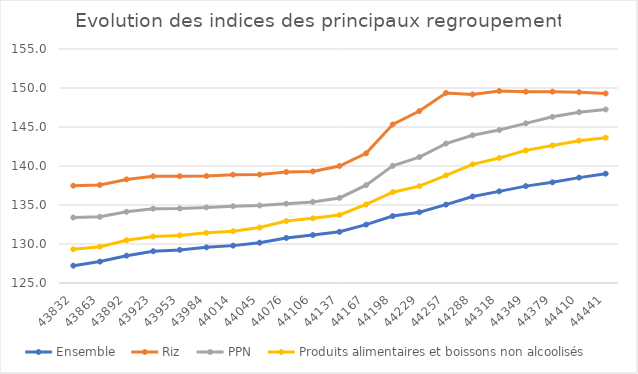
| Category |  Ensemble  |  Riz  |  PPN  |  Produits alimentaires et boissons non alcoolisés  |
|---|---|---|---|---|
| 2020-01-02 | 127.22 | 137.477 | 133.394 | 129.324 |
| 2020-02-02 | 127.747 | 137.571 | 133.482 | 129.658 |
| 2020-03-02 | 128.503 | 138.279 | 134.127 | 130.477 |
| 2020-04-02 | 129.073 | 138.691 | 134.528 | 130.962 |
| 2020-05-02 | 129.246 | 138.695 | 134.553 | 131.1 |
| 2020-06-02 | 129.569 | 138.715 | 134.691 | 131.433 |
| 2020-07-02 | 129.792 | 138.884 | 134.842 | 131.639 |
| 2020-08-02 | 130.165 | 138.908 | 134.939 | 132.108 |
| 2020-09-02 | 130.779 | 139.227 | 135.17 | 132.94 |
| 2020-10-02 | 131.152 | 139.307 | 135.396 | 133.293 |
| 2020-11-02 | 131.562 | 139.996 | 135.904 | 133.717 |
| 2020-12-02 | 132.488 | 141.627 | 137.548 | 135.07 |
| 2021-01-02 | 133.582 | 145.33 | 140.014 | 136.64 |
| 2021-02-02 | 134.068 | 147.047 | 141.147 | 137.422 |
| 2021-03-02 | 135.051 | 149.367 | 142.872 | 138.8 |
| 2021-04-02 | 136.088 | 149.178 | 143.938 | 140.217 |
| 2021-05-02 | 136.75 | 149.619 | 144.606 | 141.028 |
| 2021-06-02 | 137.421 | 149.519 | 145.469 | 142.002 |
| 2021-07-02 | 137.905 | 149.532 | 146.302 | 142.639 |
| 2021-08-02 | 138.51 | 149.461 | 146.899 | 143.242 |
| 2021-09-02 | 139.014 | 149.302 | 147.252 | 143.631 |